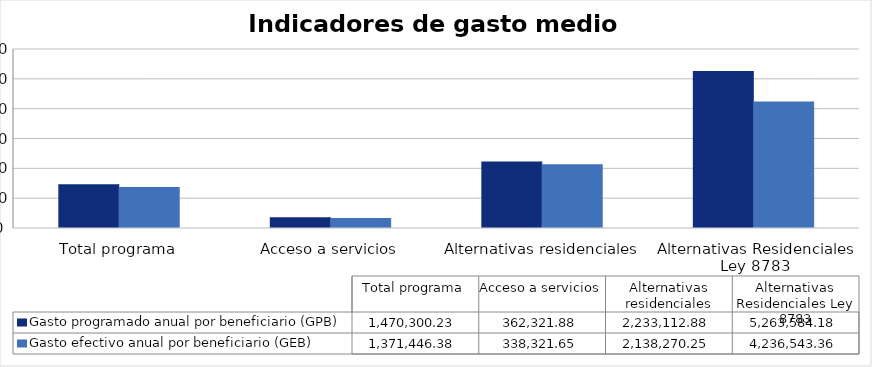
| Category | Gasto programado anual por beneficiario (GPB)  | Gasto efectivo anual por beneficiario (GEB)  |
|---|---|---|
| Total programa | 1470300.226 | 1371446.376 |
| Acceso a servicios | 362321.881 | 338321.655 |
| Alternativas residenciales | 2233112.88 | 2138270.248 |
| Alternativas Residenciales Ley 8783 | 5263584.175 | 4236543.359 |